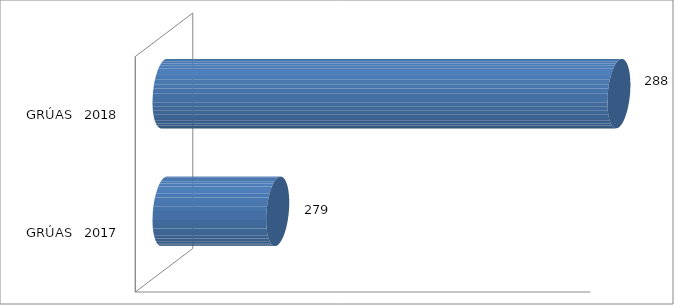
| Category | AGOSTO |
|---|---|
| GRÚAS   2017 | 279 |
| GRÚAS   2018 | 288 |